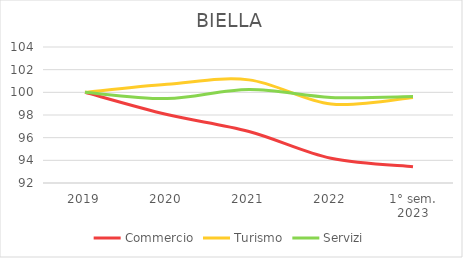
| Category | Commercio | Turismo | Servizi |
|---|---|---|---|
| 2019 | 100 | 100 | 100 |
| 2020 | 98.039 | 100.711 | 99.448 |
| 2021 | 96.542 | 101.099 | 100.249 |
| 2022 | 94.181 | 98.966 | 99.555 |
| 1° sem.
2023 | 93.443 | 99.548 | 99.626 |